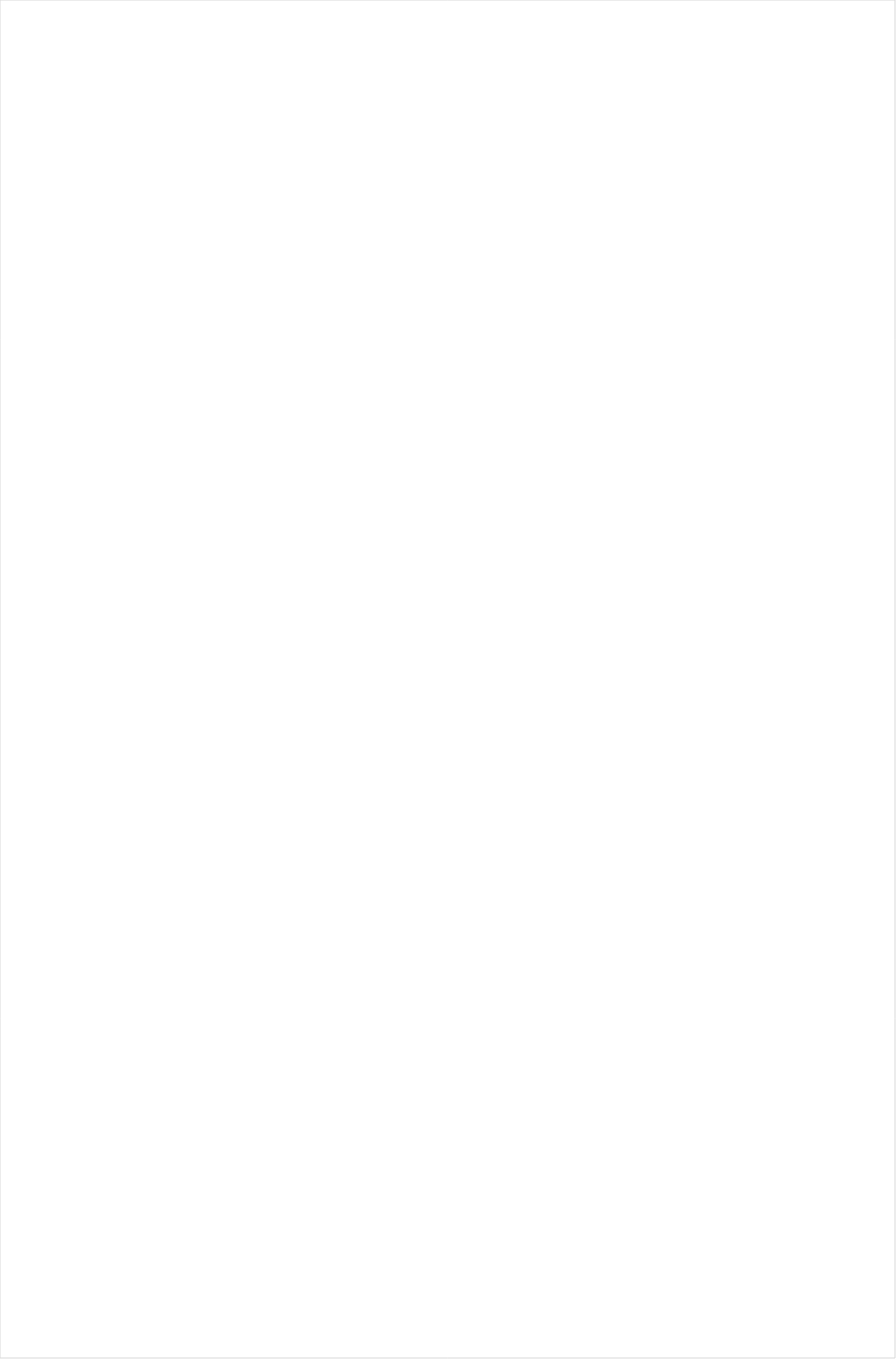
| Category | Total |
|---|---|
| Galavision | -0.819 |
| UniMas | -0.805 |
| Telemundo | -0.775 |
| NBC Universo | -0.741 |
| Univision | -0.732 |
| TUDN | -0.713 |
| ESPN Deportes | -0.634 |
| Cartoon Network | -0.437 |
| Nick Toons | -0.317 |
| Travel | -0.255 |
| Adult Swim | -0.239 |
| Lifetime Movies | -0.205 |
| Discovery Life Channel | -0.192 |
| Nick | -0.188 |
| Disney XD | -0.18 |
| Disney Channel | -0.18 |
| Logo | -0.175 |
| Nick Jr. | -0.144 |
| Investigation Discovery | -0.143 |
| TLC | -0.135 |
| Hallmark Movies & Mysteries | -0.133 |
| VH1 | -0.122 |
| WE TV | -0.12 |
| OXYGEN | -0.117 |
| Teen Nick | -0.117 |
| INSP | -0.116 |
| ION | -0.109 |
| Science Channel | -0.099 |
| Headline News | -0.085 |
| Oprah Winfrey Network | -0.084 |
| UP TV | -0.083 |
| Hallmark | -0.079 |
| Nick@Nite | -0.079 |
| Disney Junior US | -0.073 |
| Universal Kids | -0.072 |
| CW | -0.069 |
| Lifetime | -0.065 |
| MyNetworkTV | -0.043 |
| BET | -0.032 |
| Animal Planet | -0.015 |
| Motor Trend Network | -0.008 |
| BET Her | -0.008 |
| MTV | 0.02 |
| Paramount Network | 0.023 |
| National Geographic Wild | 0.026 |
| E! | 0.027 |
| History Channel | 0.03 |
| A&E | 0.031 |
| Discovery Family Channel | 0.032 |
| Great American Country | 0.038 |
| Discovery Channel | 0.049 |
| SYFY | 0.049 |
| TV ONE | 0.049 |
| TV LAND | 0.054 |
| CMTV | 0.056 |
| Freeform | 0.063 |
| BRAVO | 0.065 |
| MTV2 | 0.066 |
| RFD TV | 0.08 |
| FOX | 0.089 |
| FX | 0.099 |
| FYI | 0.099 |
| FX Movie Channel | 0.103 |
| POP | 0.109 |
| Ovation | 0.118 |
| MSNBC | 0.122 |
| WGN America | 0.124 |
| SundanceTV | 0.125 |
| National Geographic | 0.127 |
| HGTV | 0.128 |
| Fox Business | 0.129 |
| USA Network | 0.133 |
| Reelz Channel | 0.143 |
| Smithsonian | 0.147 |
| American Heroes Channel | 0.152 |
| TBS | 0.155 |
| FXDEP | 0.156 |
| PBS | 0.164 |
| FXX | 0.166 |
| Food Network | 0.175 |
| ABC | 0.176 |
| Fox News | 0.181 |
| TNT | 0.187 |
| Olympic Channel | 0.188 |
| NBC | 0.194 |
| Game Show | 0.202 |
| Weather Channel | 0.215 |
| AMC | 0.221 |
| CNN | 0.227 |
| BBC America | 0.246 |
| truTV | 0.251 |
| Destination America | 0.252 |
| CBS | 0.259 |
| Bloomberg HD | 0.268 |
| DIY | 0.281 |
| CNBC | 0.281 |
| Independent Film (IFC) | 0.294 |
| Cooking Channel | 0.295 |
| Outdoor Channel | 0.302 |
| Comedy Central | 0.312 |
| The Sportsman Channel | 0.364 |
| Viceland | 0.365 |
| Tennis Channel | 0.43 |
| NBC Sports | 0.592 |
| CBS Sports | 0.649 |
| Fox Sports 1 | 0.771 |
| NFL Network | 0.799 |
| NHL | 0.901 |
| MLB Network | 0.96 |
| ESPNEWS | 0.977 |
| ESPN2 | 1.04 |
| Golf | 1.068 |
| NBA TV | 1.092 |
| PAC-12 Network | 1.191 |
| ESPN | 1.255 |
| ESPNU | 1.271 |
| Big Ten Network | 1.404 |